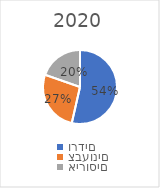
| Category | 2020 |
|---|---|
| ורדים | 0.536 |
| צבעונים | 0.268 |
| אירוסים | 0.196 |